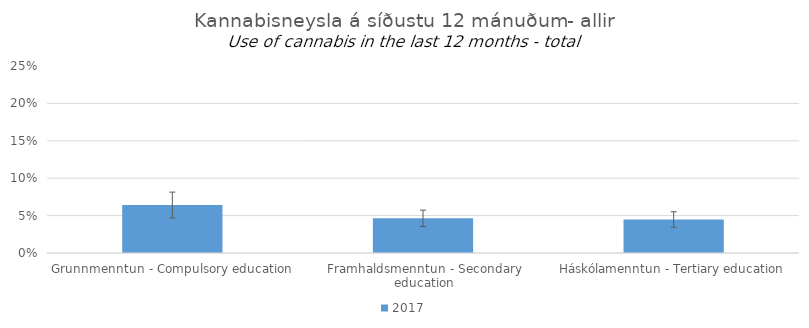
| Category | 2017 |
|---|---|
| Grunnmenntun - Compulsory education | 0.064 |
| Framhaldsmenntun - Secondary education | 0.046 |
| Háskólamenntun - Tertiary education | 0.045 |